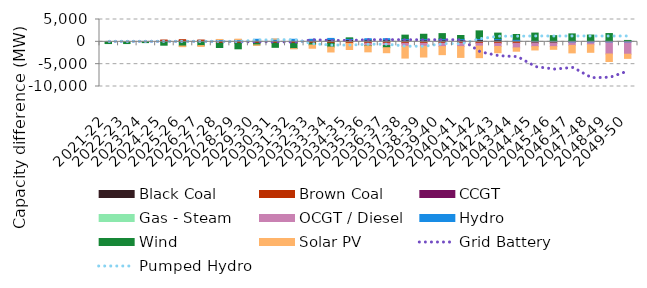
| Category | Black Coal | Brown Coal | CCGT | Gas - Steam | OCGT / Diesel | Hydro | Wind | Solar PV |
|---|---|---|---|---|---|---|---|---|
| 2021-22 | 0 | 0 | 0 | 0 | 0 | 0 | -385.338 | 0 |
| 2022-23 | 0 | 0 | 0 | 0 | 0 | 0 | -385.338 | 0 |
| 2023-24 | 0 | 0 | 0 | 0 | 0 | 0 | -172.55 | 0 |
| 2024-25 | 234.202 | 171.367 | 0 | 0 | 0 | 0 | -753.376 | 0 |
| 2025-26 | 309.917 | 173.118 | 0 | 0 | 0 | 0 | -941.264 | -137.374 |
| 2026-27 | 258.692 | 145.782 | 0 | 0 | 0 | 0 | -842.864 | -183.688 |
| 2027-28 | 246.412 | -319.686 | 0 | 0 | 0 | 250 | -943.232 | 35.429 |
| 2028-29 | 246.412 | -319.686 | 0 | 0 | 0 | 250 | -1242.026 | 98.482 |
| 2029-30 | 320.721 | -319.686 | 0 | 0 | 0 | 250 | -374.24 | -74.093 |
| 2030-31 | 320.721 | -319.686 | 0 | 0 | 0 | 250 | -911.57 | 84.483 |
| 2031-32 | 320.721 | -319.686 | 0 | 0 | 0 | 250 | -1189.118 | -34.983 |
| 2032-33 | 320.721 | -319.686 | 0 | 0 | 0 | 250 | -388.988 | -727.226 |
| 2033-34 | 515.648 | -319.686 | 0 | 0 | 0 | 250 | -846.384 | -1106.656 |
| 2034-35 | 515.648 | -319.686 | 0 | 0 | 0 | 250 | 123.943 | -1391.527 |
| 2035-36 | 447.805 | -319.686 | 0 | 0 | -517.537 | 250 | -72.399 | -1331.521 |
| 2036-37 | 458.911 | -319.686 | 0 | 0 | -517.537 | 250 | -476.957 | -1120.143 |
| 2037-38 | 458.911 | -319.686 | 0 | 0 | -673.096 | 250 | 790.445 | -2646.162 |
| 2038-39 | 458.911 | -319.686 | 0 | 0 | -673.096 | 250 | 987.497 | -2409.606 |
| 2039-40 | 458.911 | -319.686 | 0 | 0 | -742.647 | 250 | 1132.37 | -1808.483 |
| 2040-41 | 458.911 | -319.686 | 0 | 0 | -742.647 | 250 | 714.303 | -2423.802 |
| 2041-42 | 489.407 | -319.686 | 0 | 0 | -634.984 | 250 | 1716.85 | -2590.818 |
| 2042-43 | 458.911 | -319.686 | 0 | 0 | -729.153 | 250 | 1243.155 | -1382.15 |
| 2043-44 | 306.982 | -319.686 | 0 | 0 | -1034.744 | 250 | 1086.342 | -747.391 |
| 2044-45 | 0 | -319.686 | 0 | 0 | -752.322 | 250 | 1709.513 | -747.391 |
| 2045-46 | 0 | -319.686 | 0 | 0 | -752.322 | 250 | 1134.291 | -606.532 |
| 2046-47 | 0 | -128.979 | 0 | 0 | -660.127 | 250 | 1531.641 | -1685.072 |
| 2047-48 | 0 | 0 | 0 | 0 | -660.127 | 250 | 1270.199 | -1685.072 |
| 2048-49 | 0 | 0 | 0 | 0 | -2721.709 | 250 | 1607.523 | -1685.071 |
| 2049-50 | 0 | 0 | 0 | 0 | -2771.548 | 250 | 60.588 | -931.11 |